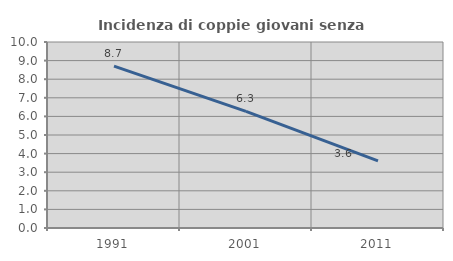
| Category | Incidenza di coppie giovani senza figli |
|---|---|
| 1991.0 | 8.707 |
| 2001.0 | 6.273 |
| 2011.0 | 3.608 |